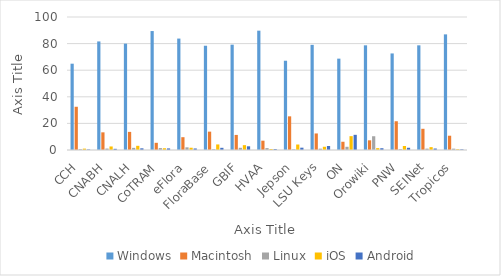
| Category | Windows | Macintosh | Linux | iOS | Android |
|---|---|---|---|---|---|
| CCH | 64.89 | 32.51 | 0.62 | 1.04 | 0.4 |
| CNABH | 81.63 | 13.28 | 1.09 | 2.66 | 0.89 |
| CNALH | 79.96 | 13.62 | 1.61 | 3.15 | 1.27 |
| CoTRAM | 89.44 | 5.41 | 1.47 | 1.33 | 1.2 |
| eFlora | 83.78 | 9.63 | 2.01 | 1.7 | 1.16 |
| FloraBase | 78.39 | 13.8 | 0.62 | 4.18 | 1.64 |
| GBIF | 79.19 | 11.34 | 1.65 | 3.65 | 2.78 |
| HVAA | 89.72 | 7 | 1.43 | 0.74 | 0.73 |
| Jepson | 67.12 | 25.31 | 0.52 | 4.12 | 1.74 |
| LSU Keys | 79.06 | 12.44 | 1.01 | 2.44 | 2.99 |
| ON | 68.69 | 6.2 | 2.41 | 10.41 | 11.41 |
| Orowiki | 78.7 | 7.28 | 10.35 | 1.42 | 1.34 |
| PNW | 72.6 | 21.62 | 0.65 | 3.02 | 1.68 |
| SEINet | 78.7 | 15.95 | 1.03 | 2.15 | 1.12 |
| Tropicos | 86.94 | 10.74 | 1.02 | 0.58 | 0.49 |